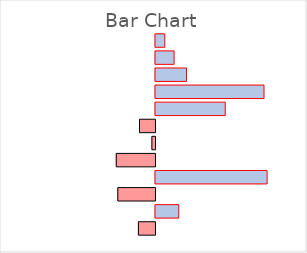
| Category | Series 0 |
|---|---|
| Cable TV | 0.2 |
| Car Insurance | 0.4 |
| Car Payment | 0.667 |
| Cell Phone | 2.333 |
| Electricity | 1.5 |
| Gasoline | -0.333 |
| Gym Membership | -0.067 |
| Hairdresser's | -0.833 |
| House Rent | 2.4 |
| Internet | -0.8 |
| Pet Care | 0.5 |
| Student Loan | -0.357 |